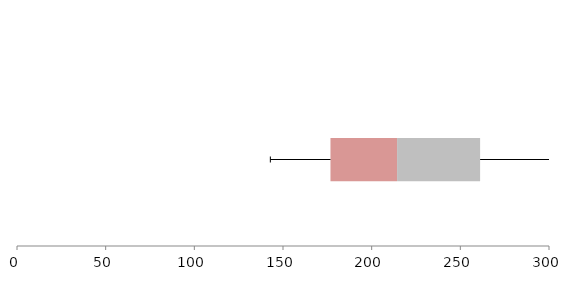
| Category | Series 1 | Series 2 | Series 3 |
|---|---|---|---|
| 0 | 176.77 | 37.561 | 46.819 |